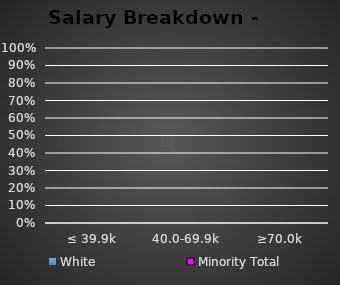
| Category | White | Minority Total |
|---|---|---|
| ≤ 39.9k | 0 | 0 |
| 40.0-69.9k | 0 | 0 |
| ≥70.0k | 0 | 0 |